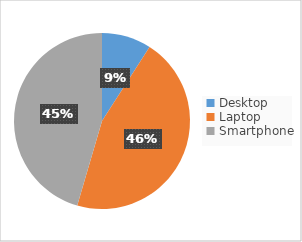
| Category | Series 0 |
|---|---|
| Desktop | 1 |
| Laptop | 5 |
| Smartphone | 5 |